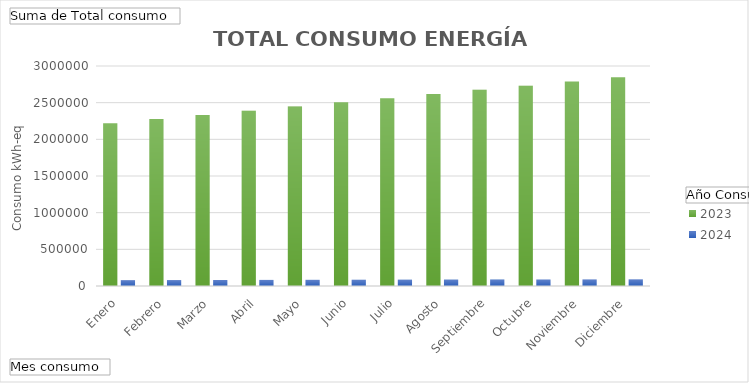
| Category | 2023 | 2024 |
|---|---|---|
| Enero | 2218651 | 80000 |
| Febrero | 2275731.7 | 81000 |
| Marzo | 2332812.4 | 82000 |
| Abril | 2389893.1 | 83000 |
| Mayo | 2446973.8 | 84000 |
| Junio | 2504054.5 | 85000 |
| Julio | 2561135.2 | 86000 |
| Agosto | 2618215.9 | 87000 |
| Septiembre | 2675296.6 | 88000 |
| Octubre | 2732377.3 | 89000 |
| Noviembre | 2789458 | 90000 |
| Diciembre | 2846538.7 | 91000 |